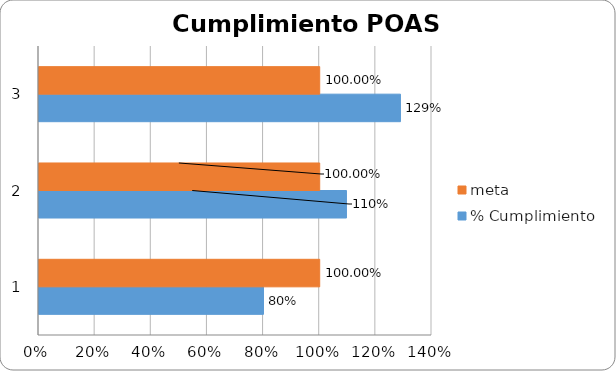
| Category | % Cumplimiento  | meta  |
|---|---|---|
| 0 | 0.8 | 1 |
| 1 | 1.095 | 1 |
| 2 | 1.288 | 1 |